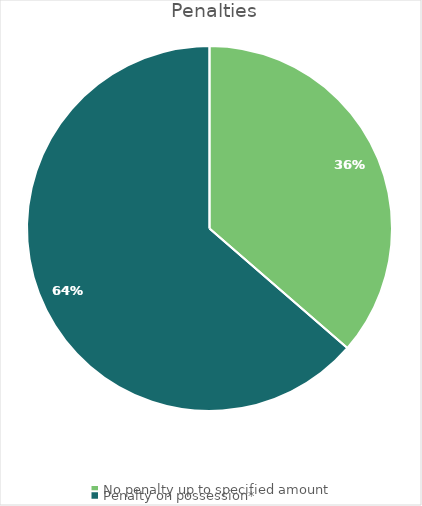
| Category | States/ Territory |
|---|---|
| No penalty up to specified amount | 20 |
| Penalty on possession* | 35 |